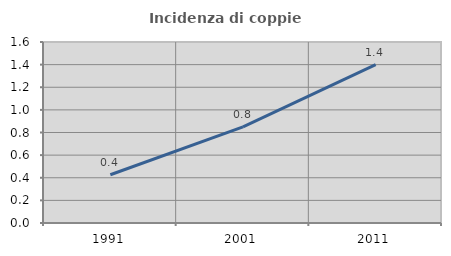
| Category | Incidenza di coppie miste |
|---|---|
| 1991.0 | 0.427 |
| 2001.0 | 0.849 |
| 2011.0 | 1.399 |